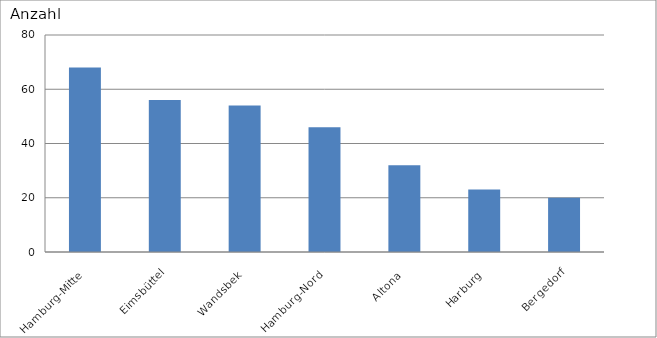
| Category | Hamburg-Mitte |
|---|---|
| Hamburg-Mitte | 68 |
| Eimsbüttel | 56 |
| Wandsbek | 54 |
| Hamburg-Nord | 46 |
| Altona | 32 |
| Harburg | 23 |
| Bergedorf | 20 |